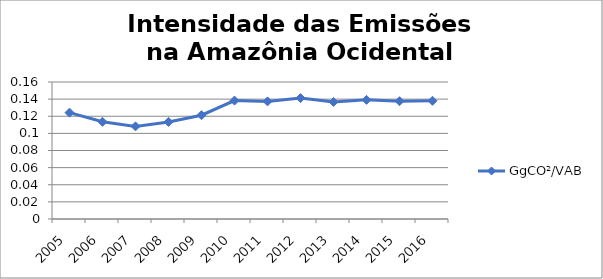
| Category | GgCO²/VAB |
|---|---|
| 2005.0 | 0.124 |
| 2006.0 | 0.113 |
| 2007.0 | 0.108 |
| 2008.0 | 0.113 |
| 2009.0 | 0.121 |
| 2010.0 | 0.138 |
| 2011.0 | 0.137 |
| 2012.0 | 0.141 |
| 2013.0 | 0.137 |
| 2014.0 | 0.139 |
| 2015.0 | 0.138 |
| 2016.0 | 0.138 |